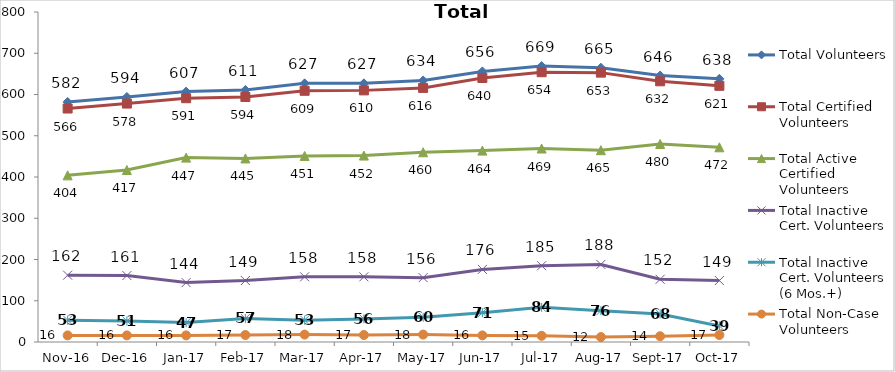
| Category | Total Volunteers | Total Certified Volunteers | Total Active Certified Volunteers | Total Inactive Cert. Volunteers | Total Inactive Cert. Volunteers (6 Mos.+) | Total Non-Case Volunteers |
|---|---|---|---|---|---|---|
| 2016-11-01 | 582 | 566 | 404 | 162 | 53 | 16 |
| 2016-12-01 | 594 | 578 | 417 | 161 | 51 | 16 |
| 2017-01-01 | 607 | 591 | 447 | 144 | 47 | 16 |
| 2017-02-01 | 611 | 594 | 445 | 149 | 57 | 17 |
| 2017-03-01 | 627 | 609 | 451 | 158 | 53 | 18 |
| 2017-04-01 | 627 | 610 | 452 | 158 | 56 | 17 |
| 2017-05-01 | 634 | 616 | 460 | 156 | 60 | 18 |
| 2017-06-01 | 656 | 640 | 464 | 176 | 71 | 16 |
| 2017-07-01 | 669 | 654 | 469 | 185 | 84 | 15 |
| 2017-08-01 | 665 | 653 | 465 | 188 | 76 | 12 |
| 2017-09-01 | 646 | 632 | 480 | 152 | 68 | 14 |
| 2017-10-01 | 638 | 621 | 472 | 149 | 39 | 17 |